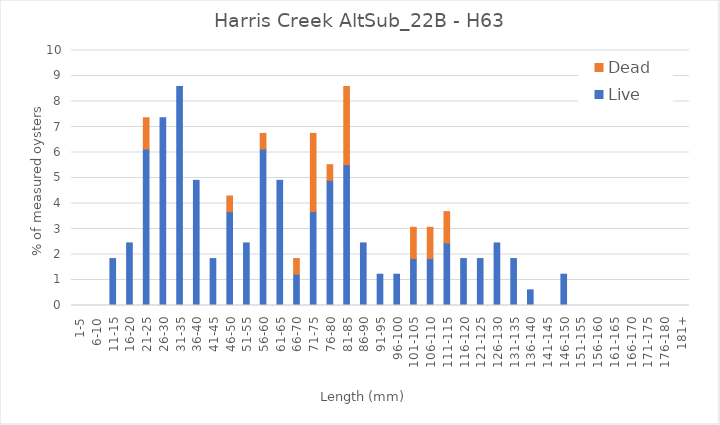
| Category | Live | Dead |
|---|---|---|
| 1-5 | 0 | 0 |
| 6-10 | 0 | 0 |
| 11-15 | 1.84 | 0 |
| 16-20 | 2.454 | 0 |
| 21-25 | 6.135 | 1.227 |
| 26-30 | 7.362 | 0 |
| 31-35 | 8.589 | 0 |
| 36-40 | 4.908 | 0 |
| 41-45 | 1.84 | 0 |
| 46-50 | 3.681 | 0.613 |
| 51-55 | 2.454 | 0 |
| 56-60 | 6.135 | 0.613 |
| 61-65 | 4.908 | 0 |
| 66-70 | 1.227 | 0.613 |
| 71-75 | 3.681 | 3.067 |
| 76-80 | 4.908 | 0.613 |
| 81-85 | 5.521 | 3.067 |
| 86-90 | 2.454 | 0 |
| 91-95 | 1.227 | 0 |
| 96-100 | 1.227 | 0 |
| 101-105 | 1.84 | 1.227 |
| 106-110 | 1.84 | 1.227 |
| 111-115 | 2.454 | 1.227 |
| 116-120 | 1.84 | 0 |
| 121-125 | 1.84 | 0 |
| 126-130 | 2.454 | 0 |
| 131-135 | 1.84 | 0 |
| 136-140 | 0.613 | 0 |
| 141-145 | 0 | 0 |
| 146-150 | 1.227 | 0 |
| 151-155 | 0 | 0 |
| 156-160 | 0 | 0 |
| 161-165 | 0 | 0 |
| 166-170 | 0 | 0 |
| 171-175 | 0 | 0 |
| 176-180 | 0 | 0 |
| 181+ | 0 | 0 |